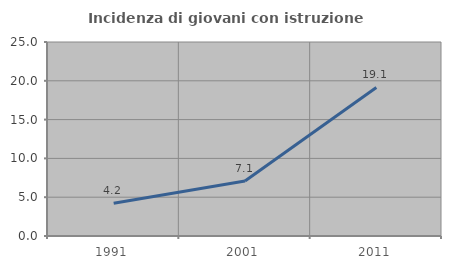
| Category | Incidenza di giovani con istruzione universitaria |
|---|---|
| 1991.0 | 4.219 |
| 2001.0 | 7.09 |
| 2011.0 | 19.139 |